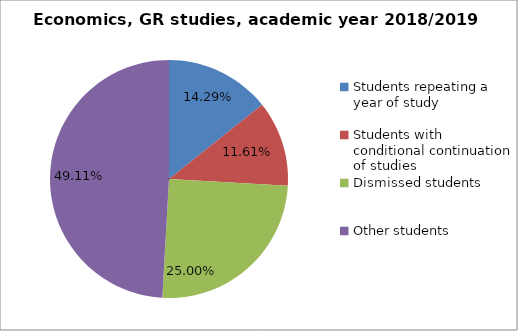
| Category | Series 0 |
|---|---|
| Students repeating a year of study | 16 |
| Students with conditional continuation of studies | 13 |
| Dismissed students | 28 |
| Other students | 55 |